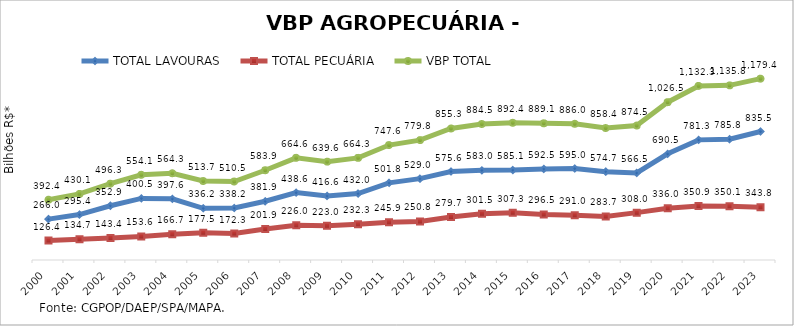
| Category | TOTAL LAVOURAS | TOTAL PECUÁRIA | VBP TOTAL |
|---|---|---|---|
| 2000 | 265.955 | 126.402 | 392.357 |
| 2001 | 295.427 | 134.689 | 430.116 |
| 2002 | 352.898 | 143.368 | 496.266 |
| 2003 | 400.537 | 153.567 | 554.103 |
| 2004 | 397.604 | 166.703 | 564.307 |
| 2005 | 336.156 | 177.506 | 513.663 |
| 2006 | 338.21 | 172.317 | 510.527 |
| 2007 | 381.946 | 201.919 | 583.865 |
| 2008 | 438.569 | 226.008 | 664.577 |
| 2009 | 416.582 | 223.005 | 639.587 |
| 2010 | 432.042 | 232.302 | 664.344 |
| 2011 | 501.763 | 245.852 | 747.615 |
| 2012 | 529.049 | 250.754 | 779.802 |
| 2013 | 575.608 | 279.731 | 855.339 |
| 2014 | 583.014 | 301.517 | 884.531 |
| 2015 | 585.129 | 307.31 | 892.44 |
| 2016 | 592.528 | 296.523 | 889.051 |
| 2017 | 594.988 | 290.968 | 885.956 |
| 2018 | 574.725 | 283.671 | 858.396 |
| 2019 | 566.461 | 308.045 | 874.505 |
| 2020 | 690.529 | 335.969 | 1026.498 |
| 2021 | 781.35 | 350.925 | 1132.275 |
| 2022 | 785.752 | 350.089 | 1135.841 |
| 2023 | 835.548 | 343.809 | 1179.357 |